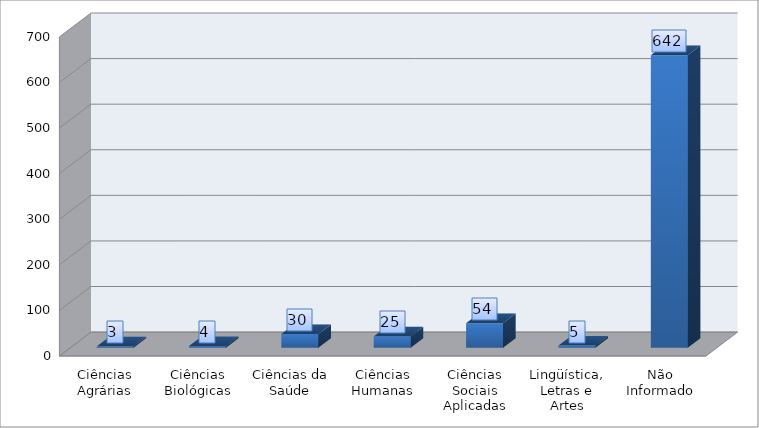
| Category | Total de produções |
|---|---|
| Ciências Agrárias | 3 |
| Ciências Biológicas | 4 |
| Ciências da Saúde | 30 |
| Ciências Humanas | 25 |
| Ciências Sociais Aplicadas | 54 |
| Lingüística, Letras e Artes | 5 |
| Não Informado | 642 |